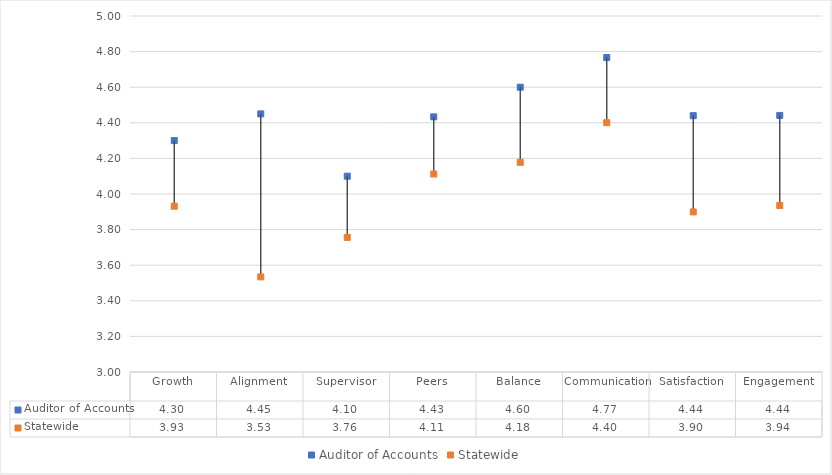
| Category | Auditor of Accounts | Statewide |
|---|---|---|
| Growth | 4.3 | 3.931 |
| Alignment | 4.45 | 3.534 |
| Supervisor | 4.1 | 3.756 |
| Peers | 4.433 | 4.112 |
| Balance | 4.6 | 4.178 |
| Communication | 4.767 | 4.4 |
| Satisfaction | 4.44 | 3.899 |
| Engagement | 4.441 | 3.936 |